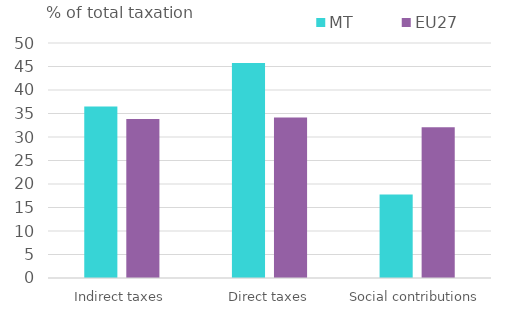
| Category | MT | EU27 |
|---|---|---|
| Indirect taxes | 36.487 | 33.811 |
| Direct taxes | 45.745 | 34.133 |
| Social contributions | 17.767 | 32.056 |